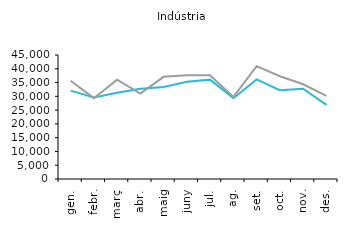
| Category | 2016 | 2017 |
|---|---|---|
| gen. | 32063 | 35649 |
| febr. | 29583 | 29333 |
| març | 31329 | 36021 |
| abr. | 32751 | 31025 |
| maig | 33368 | 37071 |
| juny | 35313 | 37661 |
| jul. | 36059 | 37626 |
| ag. | 29317 | 29796 |
| set. | 36127 | 40934 |
| oct. | 32236 | 37279 |
| nov. | 32736 | 34384 |
| des. | 26882 | 30188 |